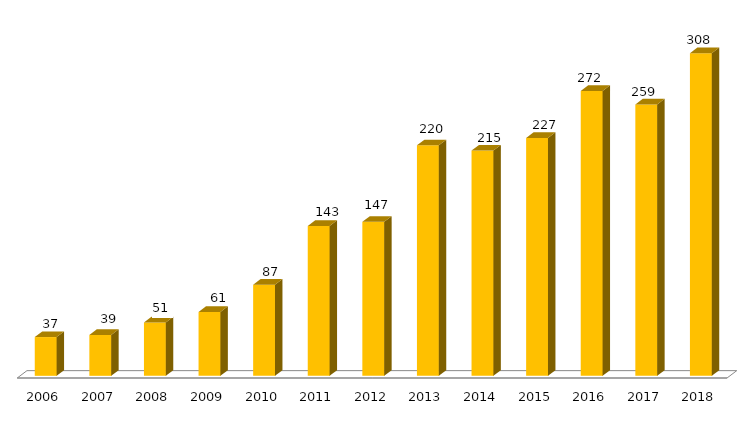
| Category | Programa |
|---|---|
| 2006.0 | 37 |
| 2007.0 | 39 |
| 2008.0 | 51 |
| 2009.0 | 61 |
| 2010.0 | 87 |
| 2011.0 | 143 |
| 2012.0 | 147 |
| 2013.0 | 220 |
| 2014.0 | 215 |
| 2015.0 | 227 |
| 2016.0 | 272 |
| 2017.0 | 259 |
| 2018.0 | 308 |